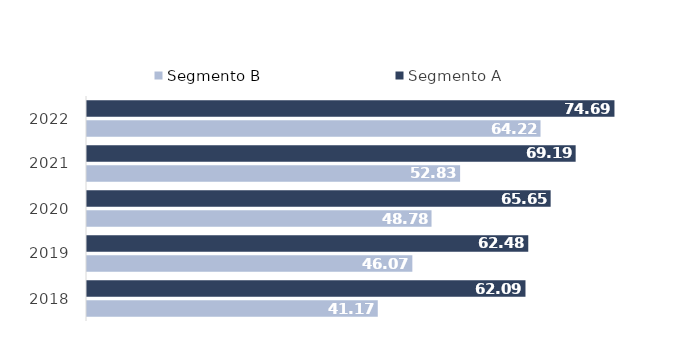
| Category | Segmento B | Segmento A |
|---|---|---|
| 2018.0 | 41.171 | 62.086 |
| 2019.0 | 46.067 | 62.48 |
| 2020.0 | 48.783 | 65.65 |
| 2021.0 | 52.83 | 69.19 |
| 2022.0 | 64.218 | 74.685 |